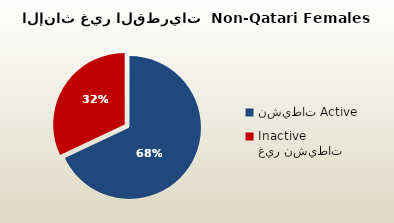
| Category | الاناث غير القطريات  Non-Qatari Females |
|---|---|
| نشيطات Active | 323595 |
| غير نشيطات Inactive | 152452 |